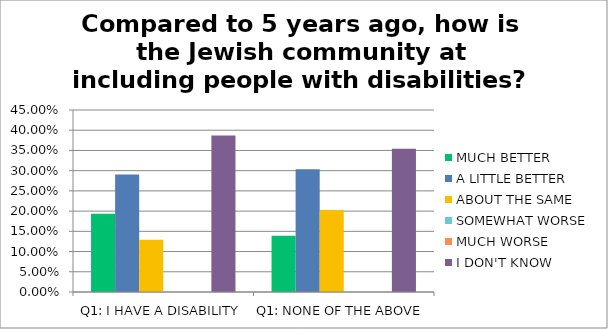
| Category | MUCH BETTER | A LITTLE BETTER | ABOUT THE SAME | SOMEWHAT WORSE | MUCH WORSE | I DON'T KNOW |
|---|---|---|---|---|---|---|
| Q1: I HAVE A DISABILITY | 0.194 | 0.29 | 0.129 | 0 | 0 | 0.387 |
| Q1: NONE OF THE ABOVE | 0.139 | 0.304 | 0.202 | 0 | 0 | 0.354 |